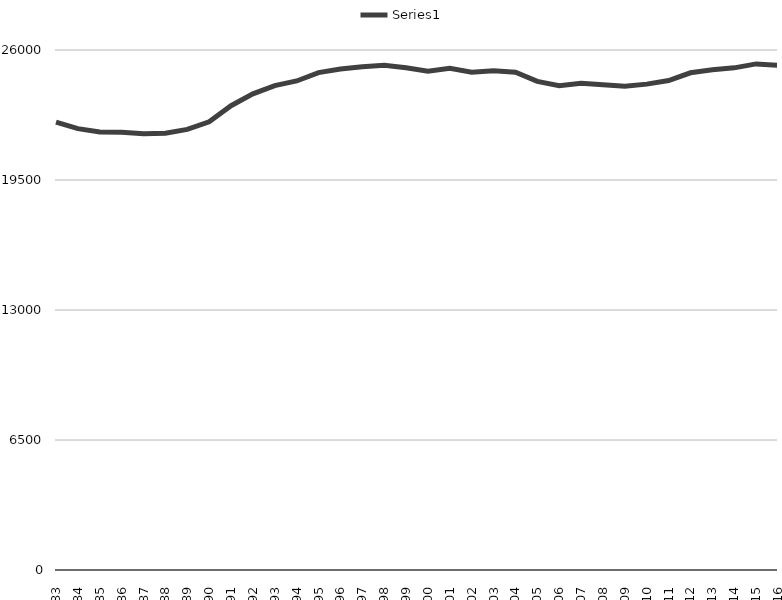
| Category | Series1 |
|---|---|
| 1983 | 22395 |
| 1984 | 22068 |
| 1985 | 21900 |
| 1986 | 21883 |
| 1987 | 21813 |
| 1988 | 21842 |
| 1989 | 22028 |
| 1990 | 22407 |
| 1991 | 23214 |
| 1992 | 23806 |
| 1993 | 24223 |
| 1994 | 24452 |
| 1995 | 24872 |
| 1996 | 25046 |
| 1997 | 25158 |
| 1998 | 25237 |
| 1999 | 25113 |
| 2000 | 24943 |
| 2001 | 25087 |
| 2002 | 24893 |
| 2003 | 24965 |
| 2004 | 24888 |
| 2005 | 24430 |
| 2006 | 24218 |
| 2007 | 24342 |
| 2008 | 24268 |
| 2009 | 24189 |
| 2010 | 24294 |
| 2011 | 24471 |
| 2012 | 24861 |
| 2013 | 25011 |
| 2014 | 25107 |
| 2015 | 25305 |
| 2016 | 25231 |